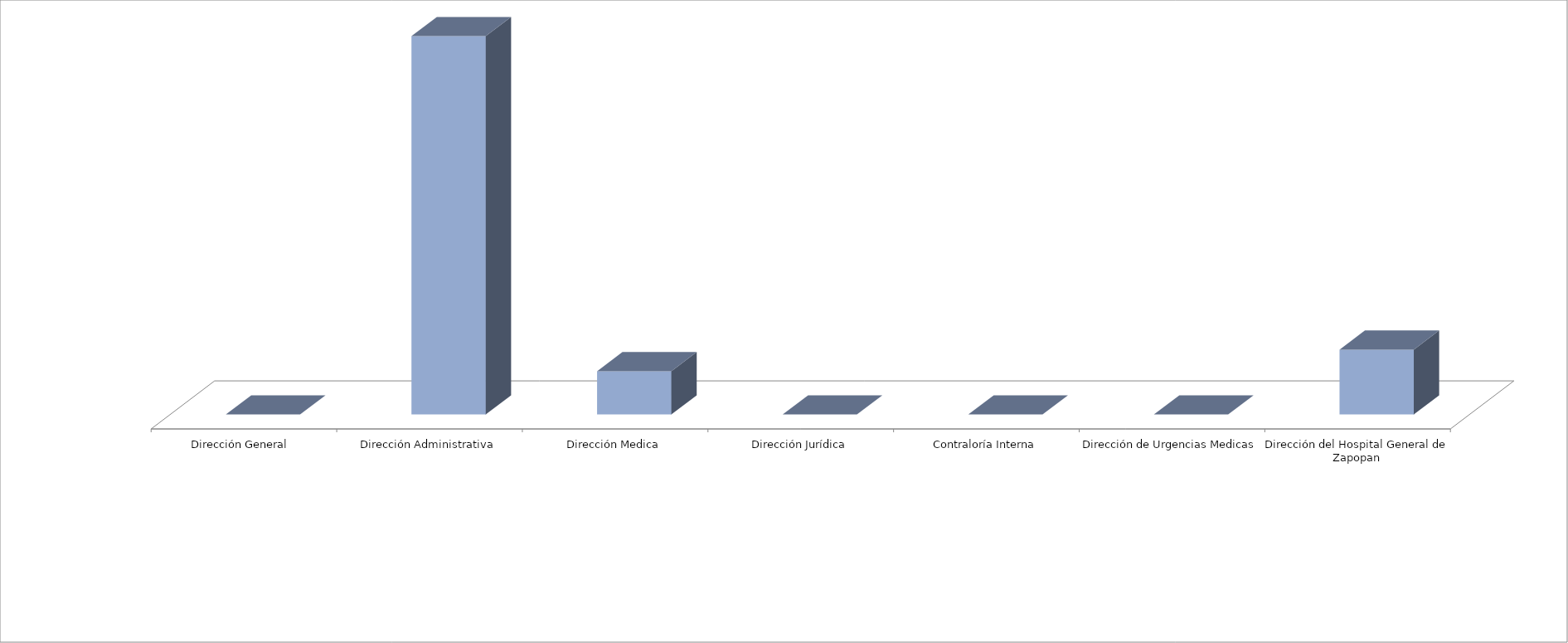
| Category | Series 0 | Series 1 |
|---|---|---|
| Dirección General  |  | 0 |
| Dirección Administrativa |  | 35 |
| Dirección Medica |  | 4 |
| Dirección Jurídica |  | 0 |
| Contraloría Interna |  | 0 |
| Dirección de Urgencias Medicas |  | 0 |
| Dirección del Hospital General de Zapopan |  | 6 |